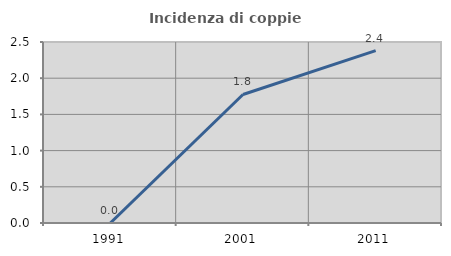
| Category | Incidenza di coppie miste |
|---|---|
| 1991.0 | 0 |
| 2001.0 | 1.775 |
| 2011.0 | 2.381 |